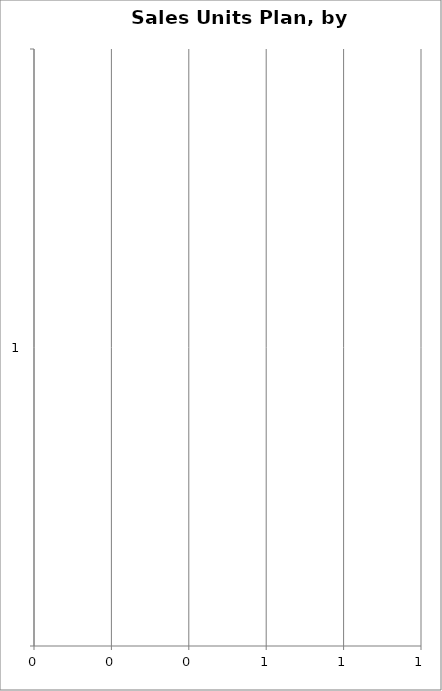
| Category | Sales Units Plan |
|---|---|
| 0 | 0 |